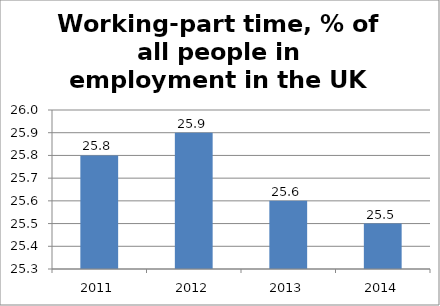
| Category | Working-part time |
|---|---|
| 2011.0 | 25.8 |
| 2012.0 | 25.9 |
| 2013.0 | 25.6 |
| 2014.0 | 25.5 |